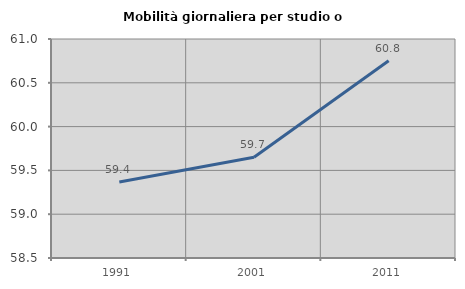
| Category | Mobilità giornaliera per studio o lavoro |
|---|---|
| 1991.0 | 59.367 |
| 2001.0 | 59.65 |
| 2011.0 | 60.752 |